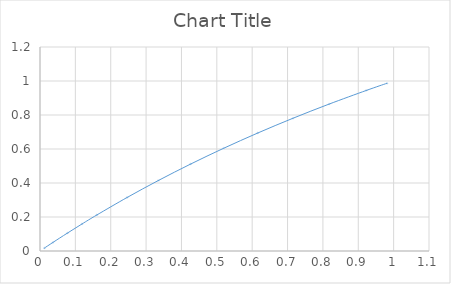
| Category | Series 0 |
|---|---|
| 0.981434430847894 | 0.987 |
| 0.923021955364217 | 0.945 |
| 0.817412239205781 | 0.864 |
| 0.715008895085316 | 0.781 |
| 0.615675847502196 | 0.694 |
| 0.519283479774659 | 0.604 |
| 0.425708291629008 | 0.511 |
| 0.334832576710786 | 0.415 |
| 0.246544118759523 | 0.315 |
| 0.160735905274365 | 0.212 |
| 0.118729804953617 | 0.159 |
| 0.0773058575769945 | 0.105 |
| 0.0364520324585133 | 0.05 |
| 0.0122084953585272 | 0.017 |